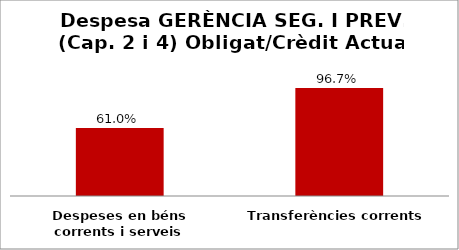
| Category | Series 0 |
|---|---|
| Despeses en béns corrents i serveis | 0.61 |
| Transferències corrents | 0.967 |